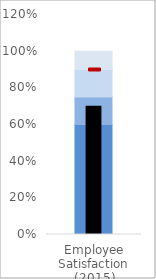
| Category | Poor | Fair | Good | Excellent |
|---|---|---|---|---|
| Employee Satisfaction (2015) | 0.6 | 0.15 | 0.15 | 0.1 |